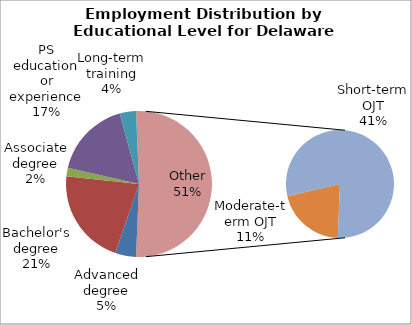
| Category | Series 0 |
|---|---|
| Advanced degree | 11270 |
| Bachelor's degree | 52160 |
| Associate degree | 4640 |
| PS education or experience | 41810 |
| Long-term training | 8760 |
| Moderate-term OJT | 25870 |
| Short-term OJT | 99100 |